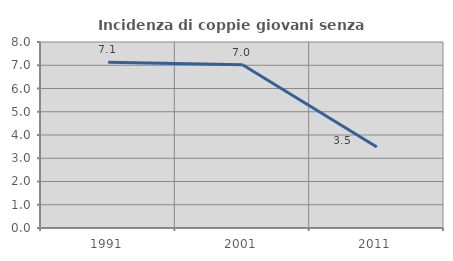
| Category | Incidenza di coppie giovani senza figli |
|---|---|
| 1991.0 | 7.13 |
| 2001.0 | 7.019 |
| 2011.0 | 3.481 |